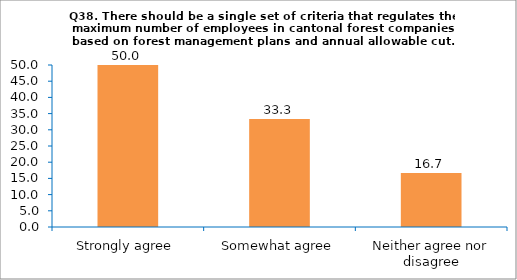
| Category | Series 0 |
|---|---|
| Strongly agree | 50 |
| Somewhat agree | 33.333 |
| Neither agree nor disagree | 16.667 |